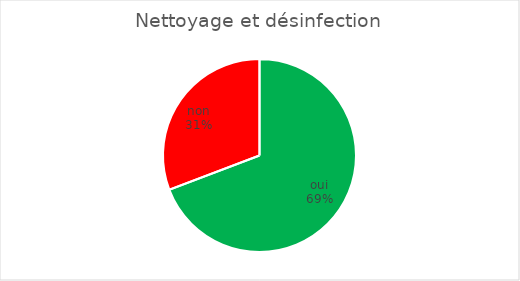
| Category | Nettoyage et désinfection |
|---|---|
| oui | 9 |
| non | 4 |